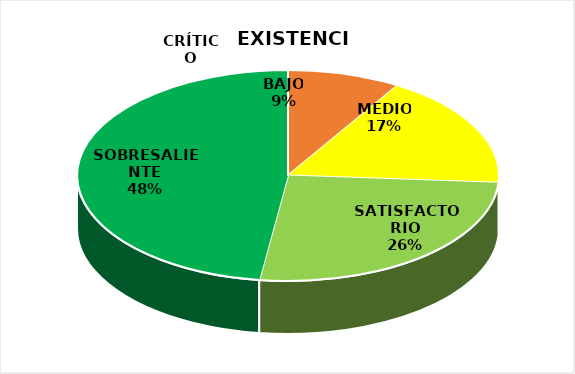
| Category | Series 1 | Series 0 |
|---|---|---|
| CRÍTICO | 0 | 2 |
| BAJO | 2 | 0 |
| MEDIO | 4 | 1 |
| SATISFACTORIO | 6 | 1 |
| SOBRESALIENTE | 11 | 53 |